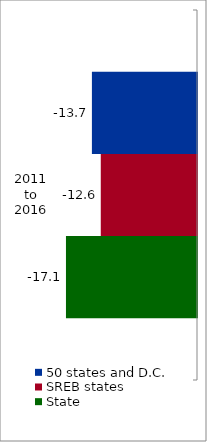
| Category | 50 states and D.C. | SREB states | State |
|---|---|---|---|
| 2011 to
2016 | -13.708 | -12.552 | -17.092 |